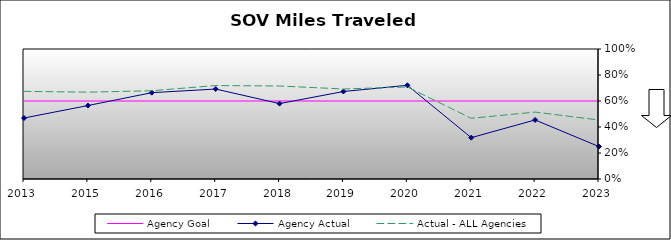
| Category | Agency Goal | Agency Actual | Actual - ALL Agencies |
|---|---|---|---|
| 2013.0 | 0.6 | 0.469 | 0.674 |
| 2015.0 | 0.6 | 0.565 | 0.668 |
| 2016.0 | 0.6 | 0.664 | 0.679 |
| 2017.0 | 0.6 | 0.692 | 0.719 |
| 2018.0 | 0.6 | 0.58 | 0.715 |
| 2019.0 | 0.6 | 0.673 | 0.692 |
| 2020.0 | 0.6 | 0.721 | 0.708 |
| 2021.0 | 0.6 | 0.318 | 0.467 |
| 2022.0 | 0.6 | 0.454 | 0.515 |
| 2023.0 | 0.6 | 0.249 | 0.454 |